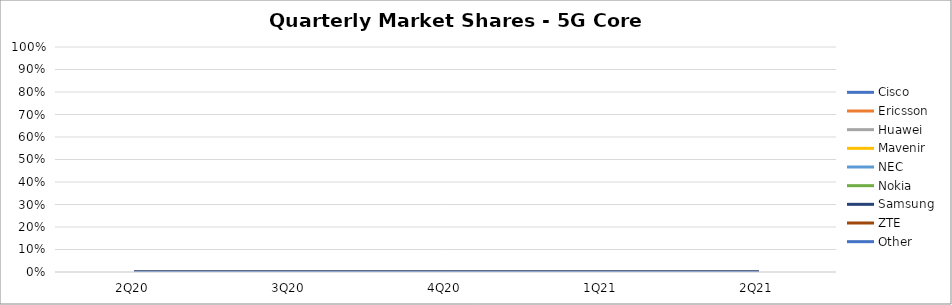
| Category | Cisco | Ericsson | Huawei | Mavenir | NEC | Nokia | Samsung | ZTE | Other |
|---|---|---|---|---|---|---|---|---|---|
| 2Q20 | 0 | 0 | 0 | 0 | 0 | 0 | 0 | 0 | 0 |
| 3Q20 | 0 | 0 | 0 | 0 | 0 | 0 | 0 | 0 | 0 |
| 4Q20 | 0 | 0 | 0 | 0 | 0 | 0 | 0 | 0 | 0 |
| 1Q21 | 0 | 0 | 0 | 0 | 0 | 0 | 0 | 0 | 0 |
| 2Q21 | 0 | 0 | 0 | 0 | 0 | 0 | 0 | 0 | 0 |